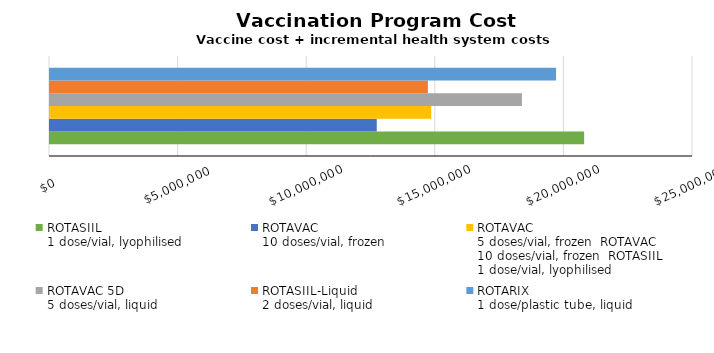
| Category | ROTASIIL
1 dose/vial, lyophilised | ROTAVAC 
10 doses/vial, frozen | ROTAVAC
5 doses/vial, frozen ROTAVAC 
10 doses/vial, frozen ROTASIIL
1 dose/vial, lyophilised | ROTAVAC 5D
5 doses/vial, liquid | ROTASIIL-Liquid
2 doses/vial, liquid | ROTARIX
1 dose/plastic tube, liquid |
|---|---|---|---|---|---|---|
| Total
for 5 years | 20767043.403 | 12704251.34 | 14822088.973 | 18349373.436 | 14693122.326 | 19675830.099 |